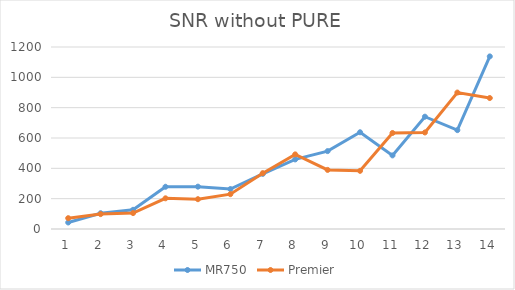
| Category | MR750 | Premier |
|---|---|---|
| 0 | 43.05 | 71.37 |
| 1 | 104.107 | 98.148 |
| 2 | 126.555 | 105.007 |
| 3 | 278.516 | 202.303 |
| 4 | 279.206 | 196.608 |
| 5 | 263.337 | 229.634 |
| 6 | 363.457 | 368.104 |
| 7 | 458.8 | 492.03 |
| 8 | 513.607 | 389.653 |
| 9 | 637.797 | 383.542 |
| 10 | 485.331 | 633.028 |
| 11 | 740.514 | 636.487 |
| 12 | 651.849 | 899.657 |
| 13 | 1137.96 | 863.486 |